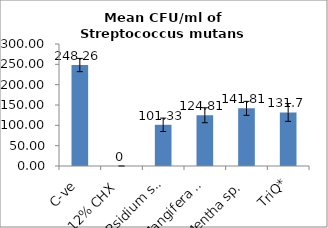
| Category | Mean CFU/ml of Streptococcus mutans ATCC 25175 Streptococcus mutans ATCC 25175 |
|---|---|
| C-ve | 248.26 |
| 0.12% CHX | 0 |
| Psidium sp. | 101.33 |
| Mangifera sp. | 124.81 |
| Mentha sp. | 141.81 |
| TriQ* | 131.7 |